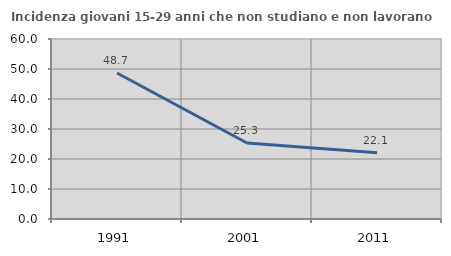
| Category | Incidenza giovani 15-29 anni che non studiano e non lavorano  |
|---|---|
| 1991.0 | 48.651 |
| 2001.0 | 25.333 |
| 2011.0 | 22.109 |